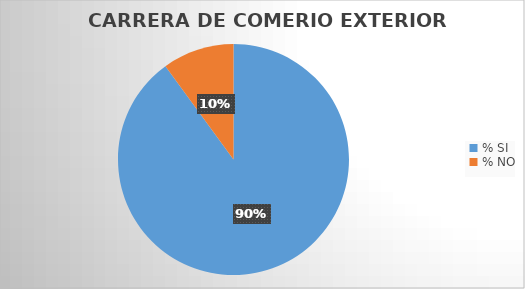
| Category | Series 0 |
|---|---|
| % SI | 94.427 |
| % NO | 10.526 |